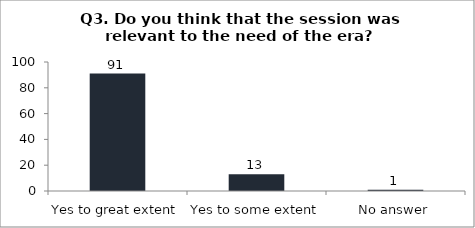
| Category | Q3. Do you think that the session was relevant to the need of the era? |
|---|---|
| Yes to great extent | 91 |
| Yes to some extent | 13 |
| No answer | 1 |